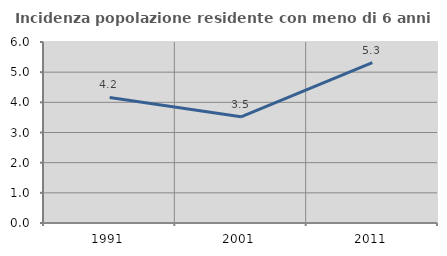
| Category | Incidenza popolazione residente con meno di 6 anni |
|---|---|
| 1991.0 | 4.161 |
| 2001.0 | 3.522 |
| 2011.0 | 5.317 |